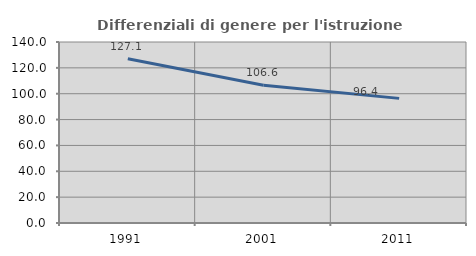
| Category | Differenziali di genere per l'istruzione superiore |
|---|---|
| 1991.0 | 127.062 |
| 2001.0 | 106.569 |
| 2011.0 | 96.394 |